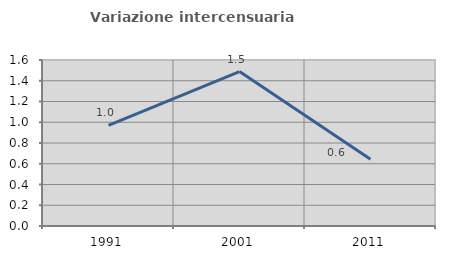
| Category | Variazione intercensuaria annua |
|---|---|
| 1991.0 | 0.97 |
| 2001.0 | 1.489 |
| 2011.0 | 0.644 |